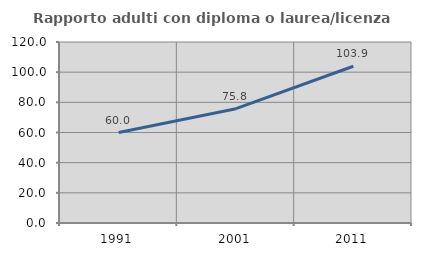
| Category | Rapporto adulti con diploma o laurea/licenza media  |
|---|---|
| 1991.0 | 59.979 |
| 2001.0 | 75.802 |
| 2011.0 | 103.901 |